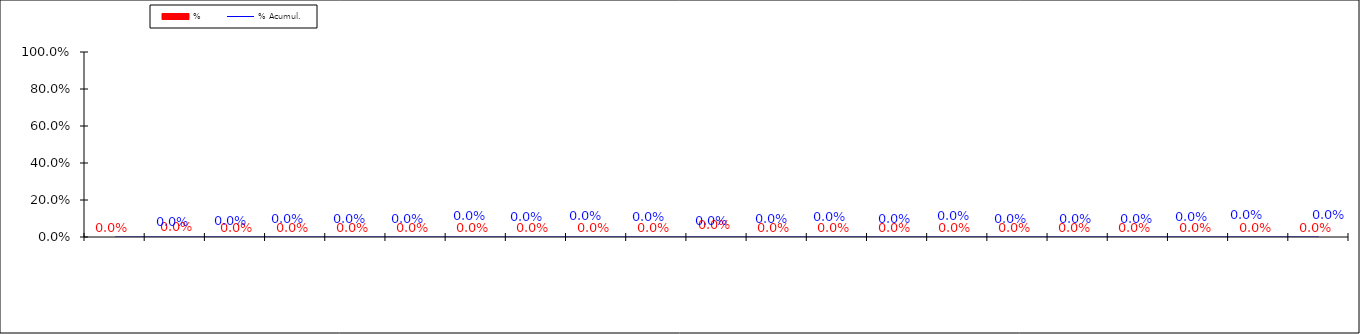
| Category | % |
|---|---|
|  | 0 |
|  | 0 |
|  | 0 |
|  | 0 |
|  | 0 |
|  | 0 |
|  | 0 |
|  | 0 |
|  | 0 |
|  | 0 |
|  | 0 |
|  | 0 |
|  | 0 |
|  | 0 |
|  | 0 |
|  | 0 |
|  | 0 |
|  | 0 |
|  | 0 |
|  | 0 |
| Otras causas | 0 |